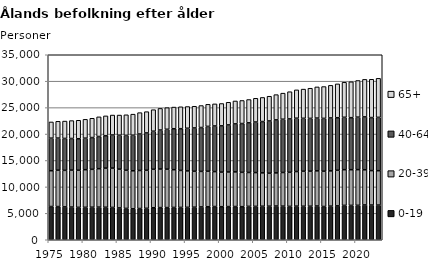
| Category | 0-19 | 20-39 | 40-64 | 65+ |
|---|---|---|---|---|
| 1975.0 | 6285 | 6776 | 6160 | 3067 |
| 1976.0 | 6281 | 6877 | 6077 | 3178 |
| 1977.0 | 6217 | 6911 | 6041 | 3283 |
| 1978.0 | 6186 | 6992 | 5979 | 3385 |
| 1979.0 | 6132 | 7018 | 5959 | 3499 |
| 1980.0 | 6137 | 7116 | 5965 | 3565 |
| 1981.0 | 6159 | 7167 | 6007 | 3651 |
| 1982.0 | 6174 | 7271 | 6086 | 3720 |
| 1983.0 | 6148 | 7405 | 6136 | 3746 |
| 1984.0 | 6114 | 7443 | 6264 | 3774 |
| 1985.0 | 6019 | 7340 | 6426 | 3806 |
| 1986.0 | 5927 | 7226 | 6599 | 3888 |
| 1987.0 | 5851 | 7195 | 6735 | 3980 |
| 1988.0 | 5907 | 7198 | 6899 | 4041 |
| 1989.0 | 5947 | 7199 | 7063 | 4022 |
| 1990.0 | 6056 | 7279 | 7198 | 4071 |
| 1991.0 | 6083 | 7297 | 7379 | 4088 |
| 1992.0 | 6086 | 7269 | 7545 | 4093 |
| 1993.0 | 6111 | 7145 | 7747 | 4099 |
| 1994.0 | 6119 | 6999 | 7896 | 4144 |
| 1995.0 | 6135 | 6892 | 8069 | 4106 |
| 1996.0 | 6160 | 6796 | 8196 | 4105 |
| 1997.0 | 6210 | 6722 | 8302 | 4158 |
| 1998.0 | 6251 | 6708 | 8489 | 4177 |
| 1999.0 | 6282 | 6614 | 8633 | 4177 |
| 2000.0 | 6253 | 6542 | 8757 | 4224 |
| 2001.0 | 6273 | 6549 | 8906 | 4280 |
| 2002.0 | 6282 | 6559 | 9080 | 4336 |
| 2003.0 | 6260 | 6494 | 9232 | 4361 |
| 2004.0 | 6319 | 6409 | 9391 | 4411 |
| 2005.0 | 6315 | 6394 | 9563 | 4494 |
| 2006.0 | 6343 | 6310 | 9707 | 4563 |
| 2007.0 | 6352 | 6237 | 9887 | 4677 |
| 2008.0 | 6379 | 6268 | 10030 | 4779 |
| 2009.0 | 6361 | 6364 | 10076 | 4933 |
| 2010.0 | 6314 | 6448 | 10100 | 5145 |
| 2011.0 | 6358 | 6546 | 10093 | 5358 |
| 2012.0 | 6341 | 6622 | 10012 | 5527 |
| 2013.0 | 6345 | 6634 | 9982 | 5705 |
| 2014.0 | 6385 | 6649 | 9983 | 5899 |
| 2015.0 | 6289 | 6674 | 9997 | 6023 |
| 2016.0 | 6361 | 6672 | 10012 | 6169 |
| 2017.0 | 6411 | 6736 | 9941 | 6401 |
| 2018.0 | 6506 | 6752 | 9911 | 6620 |
| 2019.0 | 6503 | 6754 | 9841 | 6786 |
| 2020.0 | 6517 | 6750 | 9931 | 6931 |
| 2021.0 | 6586 | 6651 | 10007 | 7100 |
| 2022.0 | 6571 | 6511 | 10037 | 7240 |
| 2023.0 | 6562 | 6502 | 10093 | 7384 |